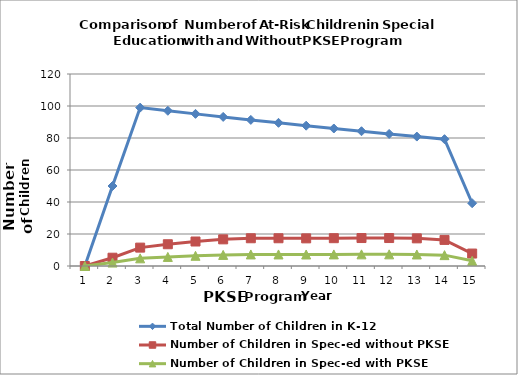
| Category | Total Number of Children in K-12 | Number of Children in Spec-ed without PKSE | Number of Children in Spec-ed with PKSE |
|---|---|---|---|
| 1.0 | 0 | 0 | 0 |
| 2.0 | 50 | 5.176 | 2.157 |
| 3.0 | 99 | 11.486 | 4.786 |
| 4.0 | 97.02 | 13.599 | 5.666 |
| 5.0 | 95.08 | 15.307 | 6.378 |
| 6.0 | 93.178 | 16.654 | 6.939 |
| 7.0 | 91.314 | 17.343 | 7.226 |
| 8.0 | 89.488 | 17.342 | 7.226 |
| 9.0 | 87.698 | 17.268 | 7.195 |
| 10.0 | 85.944 | 17.381 | 7.242 |
| 11.0 | 84.226 | 17.478 | 7.282 |
| 12.0 | 82.541 | 17.48 | 7.283 |
| 13.0 | 80.89 | 17.278 | 7.199 |
| 14.0 | 79.272 | 16.308 | 6.795 |
| 15.0 | 39.236 | 7.781 | 3.242 |